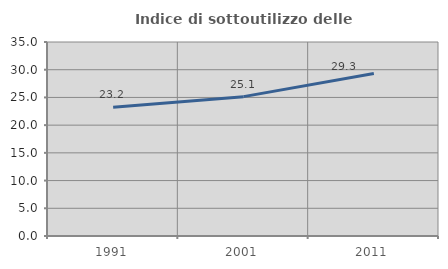
| Category | Indice di sottoutilizzo delle abitazioni  |
|---|---|
| 1991.0 | 23.217 |
| 2001.0 | 25.141 |
| 2011.0 | 29.319 |